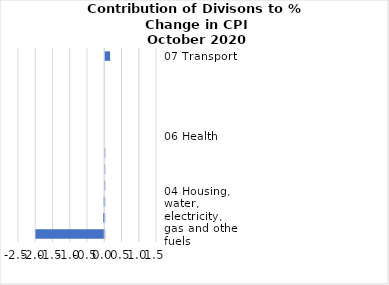
| Category |     Contributions |
|---|---|
| 07 Transport | 0.139 |
| 11 Restaurants and hotels | 0 |
| 03 Clothing and footwear | 0 |
| 10 Education | 0 |
| 08 Communication | 0 |
| 06 Health | 0 |
| 05 Furnishings, household equipment and routine household maintenance | -0.002 |
| 09 Recreation and culture | -0.003 |
| 02 Alcoholic beverages, tobacco and narcotics | -0.006 |
| 12 Miscellaneous goods and services | -0.017 |
| 04 Housing, water, electricity, gas and other fuels | -0.034 |
| 01 Food and non-alcoholic beverages | -1.995 |